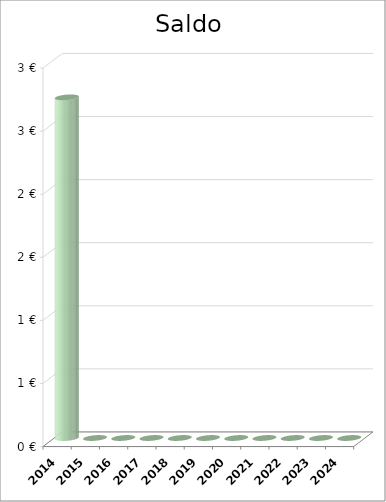
| Category | Saldo |
|---|---|
| 2014.0 | 2.7 |
| 2015.0 | 0 |
| 2016.0 | 0 |
| 2017.0 | 0 |
| 2018.0 | 0 |
| 2019.0 | 0 |
| 2020.0 | 0 |
| 2021.0 | 0 |
| 2022.0 | 0 |
| 2023.0 | 0 |
| 2024.0 | 0 |